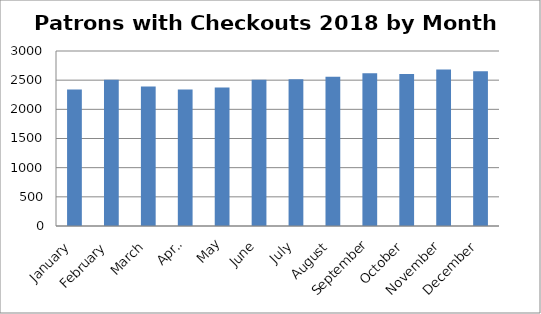
| Category | 2341 |
|---|---|
| January | 2341 |
| February | 2506 |
| March | 2391 |
| April | 2339 |
| May | 2375.419 |
| June | 2506 |
| July | 2517 |
| August | 2557 |
| September | 2618 |
| October | 2606.355 |
| November | 2683.6 |
| December | 2652.065 |